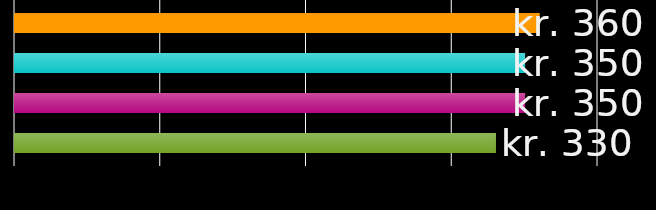
| Category | bofælle 1 | bofælle 2 | bofælle 3 | bofælle 4 |
|---|---|---|---|---|
| 0 | 360 | 350 | 350 | 330 |